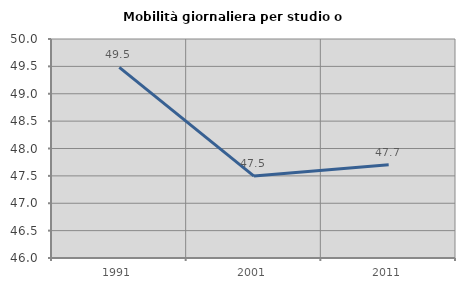
| Category | Mobilità giornaliera per studio o lavoro |
|---|---|
| 1991.0 | 49.483 |
| 2001.0 | 47.496 |
| 2011.0 | 47.705 |